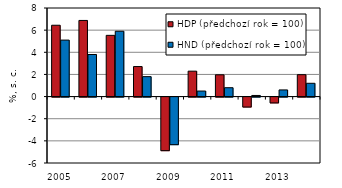
| Category | HDP (předchozí rok = 100) | HND (předchozí rok = 100) |
|---|---|---|
| 2005.0 | 6.442 | 5.1 |
| 2006.0 | 6.877 | 3.8 |
| 2007.0 | 5.529 | 5.9 |
| 2008.0 | 2.711 | 1.8 |
| 2009.0 | -4.842 | -4.3 |
| 2010.0 | 2.295 | 0.5 |
| 2011.0 | 1.967 | 0.8 |
| 2012.0 | -0.9 | 0.1 |
| 2013.0 | -0.528 | 0.6 |
| 2014.0 | 1.978 | 1.2 |